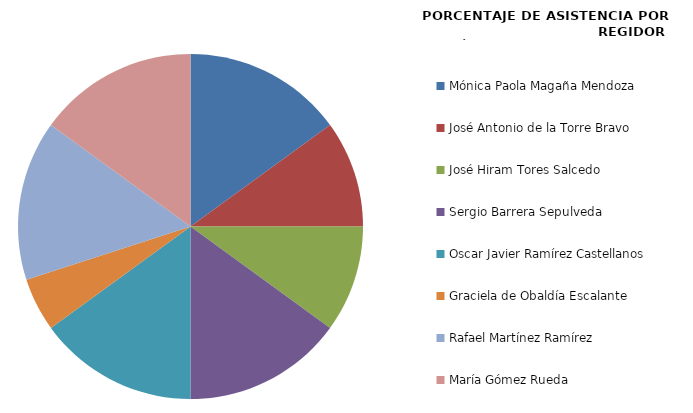
| Category | Series 0 |
|---|---|
| Mónica Paola Magaña Mendoza | 100 |
| José Antonio de la Torre Bravo | 66.667 |
| José Hiram Tores Salcedo | 66.667 |
| Sergio Barrera Sepulveda | 100 |
| Oscar Javier Ramírez Castellanos | 100 |
| Graciela de Obaldía Escalante | 33.333 |
| Rafael Martínez Ramírez | 100 |
| María Gómez Rueda | 100 |